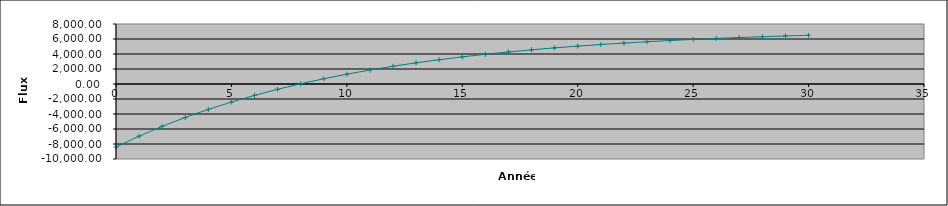
| Category | Flux cumulés et actualisés |
|---|---|
| 0.0 | -8400 |
| 1.0 | -6963.636 |
| 2.0 | -5657.851 |
| 3.0 | -4470.774 |
| 4.0 | -3391.613 |
| 5.0 | -2410.557 |
| 6.0 | -1518.688 |
| 7.0 | -707.898 |
| 8.0 | 29.183 |
| 9.0 | 699.258 |
| 10.0 | 1308.416 |
| 11.0 | 1862.196 |
| 12.0 | 2365.633 |
| 13.0 | 2823.303 |
| 14.0 | 3239.366 |
| 15.0 | 3617.606 |
| 16.0 | 3961.46 |
| 17.0 | 4274.054 |
| 18.0 | 4558.231 |
| 19.0 | 4816.574 |
| 20.0 | 5051.431 |
| 21.0 | 5264.937 |
| 22.0 | 5459.034 |
| 23.0 | 5635.485 |
| 24.0 | 5795.896 |
| 25.0 | 5941.723 |
| 26.0 | 6074.294 |
| 27.0 | 6194.813 |
| 28.0 | 6304.375 |
| 29.0 | 6403.977 |
| 30.0 | 6494.525 |